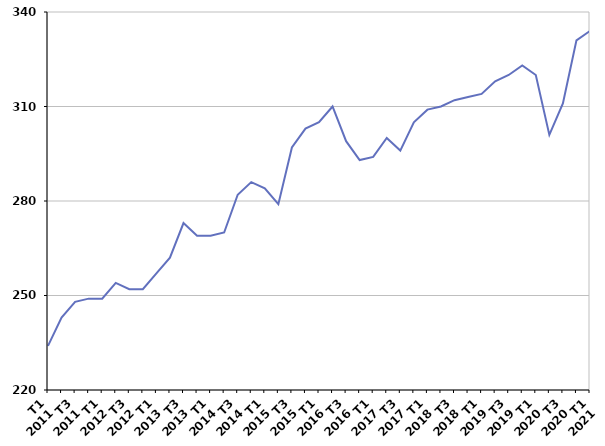
| Category | Durée moyenne d'inscription sur les listes des sortants |
|---|---|
| T1
2011 | 234 |
| T2
2011 | 243 |
| T3
2011 | 248 |
| T4
2011 | 249 |
| T1
2012 | 249 |
| T2
2012 | 254 |
| T3
2012 | 252 |
| T4
2012 | 252 |
| T1
2013 | 257 |
| T2
2013 | 262 |
| T3
2013 | 273 |
| T4
2013 | 269 |
| T1
2014 | 269 |
| T2
2014 | 270 |
| T3
2014 | 282 |
| T4
2014 | 286 |
| T1
2015 | 284 |
| T2
2015 | 279 |
| T3
2015 | 297 |
| T4
2015 | 303 |
| T1
2016 | 305 |
| T2
2016 | 310 |
| T3
2016 | 299 |
| T4
2016 | 293 |
| T1
2017 | 294 |
| T2
2017 | 300 |
| T3
2017 | 296 |
| T4
2017 | 305 |
| T1
2018 | 309 |
| T2
2018 | 310 |
| T3
2018 | 312 |
| T4
2018 | 313 |
| T1
2019 | 314 |
| T2
2019 | 318 |
| T3
2019 | 320 |
| T4
2019 | 323 |
| T1
2020 | 320 |
| T2
2020 | 301 |
| T3
2020 | 311 |
| T4
2020 | 331 |
| T1
2021 | 334 |